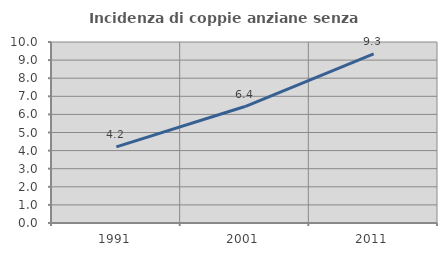
| Category | Incidenza di coppie anziane senza figli  |
|---|---|
| 1991.0 | 4.203 |
| 2001.0 | 6.435 |
| 2011.0 | 9.339 |